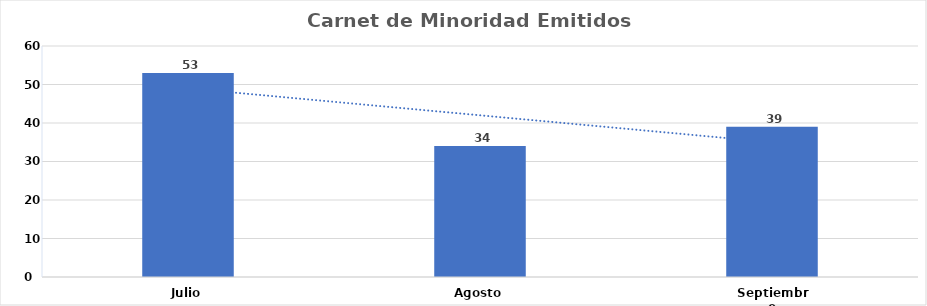
| Category | Series 0 |
|---|---|
| Julio | 53 |
| Agosto | 34 |
| Septiembre | 39 |